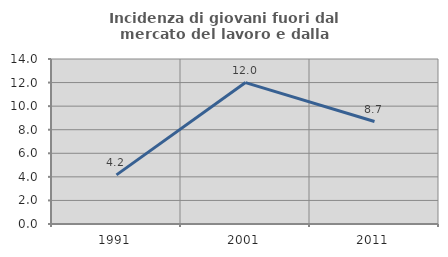
| Category | Incidenza di giovani fuori dal mercato del lavoro e dalla formazione  |
|---|---|
| 1991.0 | 4.167 |
| 2001.0 | 12 |
| 2011.0 | 8.696 |